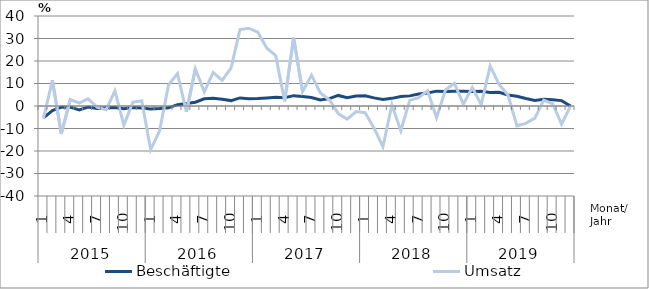
| Category | Beschäftigte | Umsatz |
|---|---|---|
| 0 | -5.3 | -5.5 |
| 1 | -2 | 11.4 |
| 2 | -0.5 | -12.4 |
| 3 | -0.5 | 2.9 |
| 4 | -1.7 | 1.3 |
| 5 | -0.5 | 3.2 |
| 6 | -1.1 | -0.5 |
| 7 | -0.8 | -1.7 |
| 8 | -0.7 | 6.7 |
| 9 | -1.2 | -8.5 |
| 10 | -0.7 | 1.7 |
| 11 | -0.9 | 2.3 |
| 12 | -1.3 | -19.4 |
| 13 | -1.1 | -11 |
| 14 | -0.8 | 9.4 |
| 15 | 0.6 | 14.4 |
| 16 | 1.1 | -2.6 |
| 17 | 1.7 | 16.5 |
| 18 | 3.2 | 6.3 |
| 19 | 3.4 | 14.9 |
| 20 | 3 | 11.4 |
| 21 | 2.4 | 16.9 |
| 22 | 3.6 | 34 |
| 23 | 3.2 | 34.5 |
| 24 | 3.3 | 32.8 |
| 25 | 3.6 | 25.7 |
| 26 | 3.9 | 22.4 |
| 27 | 3.7 | 2.1 |
| 28 | 4.6 | 30.4 |
| 29 | 4.2 | 6.4 |
| 30 | 3.8 | 13.7 |
| 31 | 2.7 | 5.8 |
| 32 | 3.3 | 2.8 |
| 33 | 4.7 | -3.4 |
| 34 | 3.7 | -5.8 |
| 35 | 4.4 | -2.5 |
| 36 | 4.5 | -3 |
| 37 | 3.6 | -9.8 |
| 38 | 2.9 | -18.1 |
| 39 | 3.4 | 0.5 |
| 40 | 4.2 | -11 |
| 41 | 4.5 | 2.5 |
| 42 | 5.3 | 3.7 |
| 43 | 5.8 | 6.8 |
| 44 | 6.6 | -5.2 |
| 45 | 6.5 | 7.1 |
| 46 | 6.6 | 10.1 |
| 47 | 6.6 | 0.8 |
| 48 | 6.4 | 8.2 |
| 49 | 6.5 | 0.6 |
| 50 | 6 | 17.8 |
| 51 | 6.1 | 9.6 |
| 52 | 4.9 | 4.9 |
| 53 | 4.3 | -8.8 |
| 54 | 3.3 | -7.7 |
| 55 | 2.5 | -5.4 |
| 56 | 3 | 2.6 |
| 57 | 2.8 | 1 |
| 58 | 2.4 | -8.1 |
| 59 | 0 | 0 |